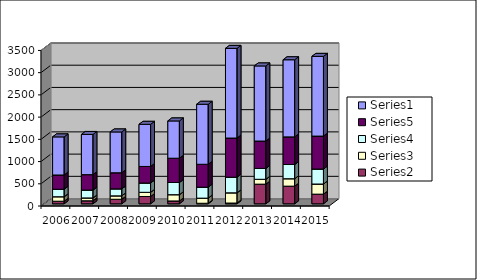
| Category | Series 1 | Series 2 | Series 3 | Series 4 | Series 0 |
|---|---|---|---|---|---|
| 2006.0 | 58 | 101 | 169 | 320 | 857 |
| 2007.0 | 68 | 64 | 177 | 347 | 904 |
| 2008.0 | 102 | 77 | 157 | 362 | 918 |
| 2009.0 | 164 | 94 | 210 | 372 | 948 |
| 2010.0 | 64 | 141 | 274 | 546 | 839 |
| 2011.0 | 12 | 115 | 247 | 515 | 1350 |
| 2012.0 | 17 | 230 | 352 | 880 | 2017 |
| 2013.0 | 442 | 109 | 245 | 615 | 1690 |
| 2014.0 | 397 | 167 | 320 | 621 | 1735 |
| 2015.0 | 217 | 228 | 337 | 741 | 1793 |